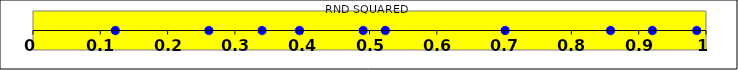
| Category | RND SQUARED |
|---|---|
| 0.5235519487011274 | 0 |
| 0.12230884167231788 | 0 |
| 0.2613283401278729 | 0 |
| 0.4906580673397771 | 0 |
| 0.8581940545886442 | 0 |
| 0.7016015833464653 | 0 |
| 0.920336045886645 | 0 |
| 0.395974808420415 | 0 |
| 0.9862856929596127 | 0 |
| 0.3403819532866777 | 0 |